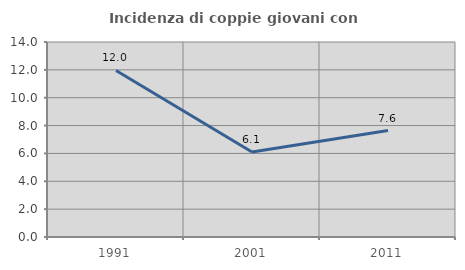
| Category | Incidenza di coppie giovani con figli |
|---|---|
| 1991.0 | 11.957 |
| 2001.0 | 6.098 |
| 2011.0 | 7.643 |